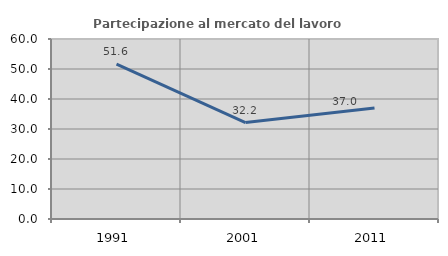
| Category | Partecipazione al mercato del lavoro  femminile |
|---|---|
| 1991.0 | 51.647 |
| 2001.0 | 32.158 |
| 2011.0 | 36.995 |